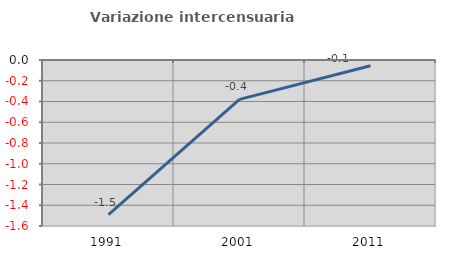
| Category | Variazione intercensuaria annua |
|---|---|
| 1991.0 | -1.491 |
| 2001.0 | -0.38 |
| 2011.0 | -0.056 |